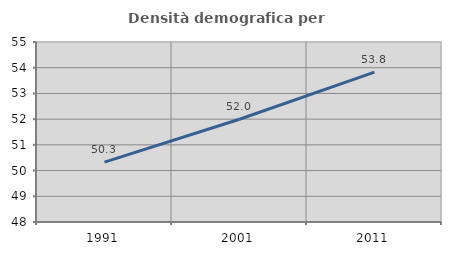
| Category | Densità demografica |
|---|---|
| 1991.0 | 50.33 |
| 2001.0 | 51.997 |
| 2011.0 | 53.83 |